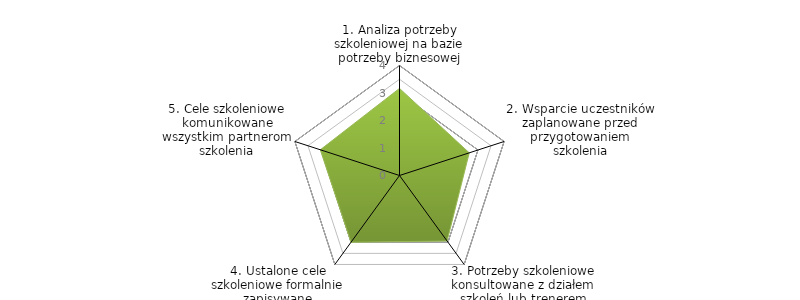
| Category | Series 0 | BENCHMARK |
|---|---|---|
| 1. Analiza potrzeby szkoleniowej na bazie potrzeby biznesowej |  | 3.167 |
| 2. Wsparcie uczestników zaplanowane przed przygotowaniem szkolenia |  | 2.667 |
| 3. Potrzeby szkoleniowe konsultowane z działem szkoleń lub trenerem |  | 2.944 |
| 4. Ustalone cele szkoleniowe formalnie zapisywane |  | 3 |
| 5. Cele szkoleniowe komunikowane wszystkim partnerom szkolenia |  | 3.028 |